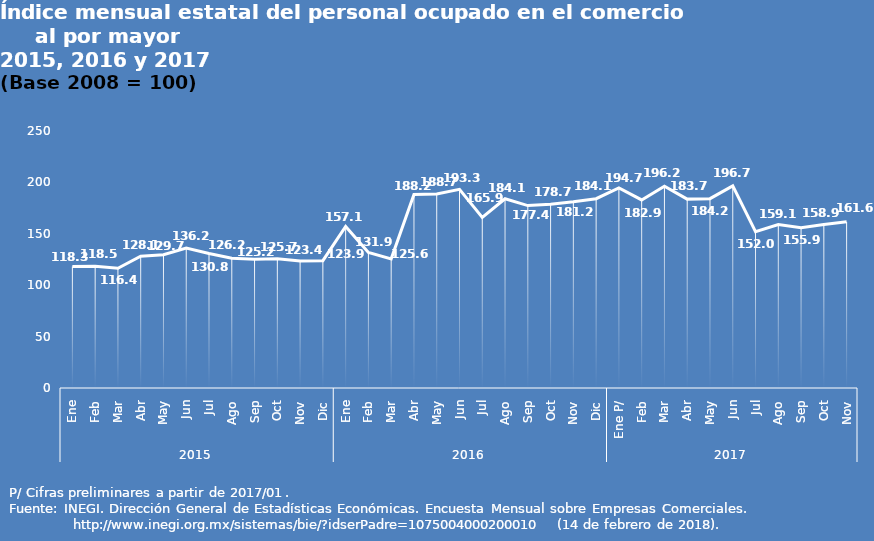
| Category | Series 0 |
|---|---|
| 0 | 118.25 |
| 1 | 118.548 |
| 2 | 116.406 |
| 3 | 128.12 |
| 4 | 129.658 |
| 5 | 136.172 |
| 6 | 130.815 |
| 7 | 126.169 |
| 8 | 125.234 |
| 9 | 125.685 |
| 10 | 123.432 |
| 11 | 123.86 |
| 12 | 157.121 |
| 13 | 131.867 |
| 14 | 125.633 |
| 15 | 188.247 |
| 16 | 188.737 |
| 17 | 193.308 |
| 18 | 165.917 |
| 19 | 184.096 |
| 20 | 177.435 |
| 21 | 178.747 |
| 22 | 181.186 |
| 23 | 184.143 |
| 24 | 194.727 |
| 25 | 182.946 |
| 26 | 196.202 |
| 27 | 183.733 |
| 28 | 184.174 |
| 29 | 196.667 |
| 30 | 152.032 |
| 31 | 159.075 |
| 32 | 155.878 |
| 33 | 158.943 |
| 34 | 161.629 |